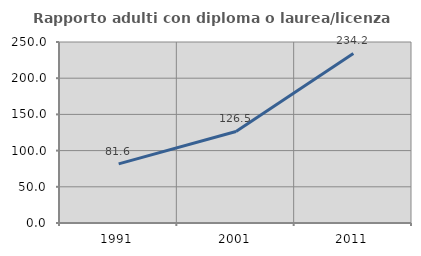
| Category | Rapporto adulti con diploma o laurea/licenza media  |
|---|---|
| 1991.0 | 81.625 |
| 2001.0 | 126.452 |
| 2011.0 | 234.231 |